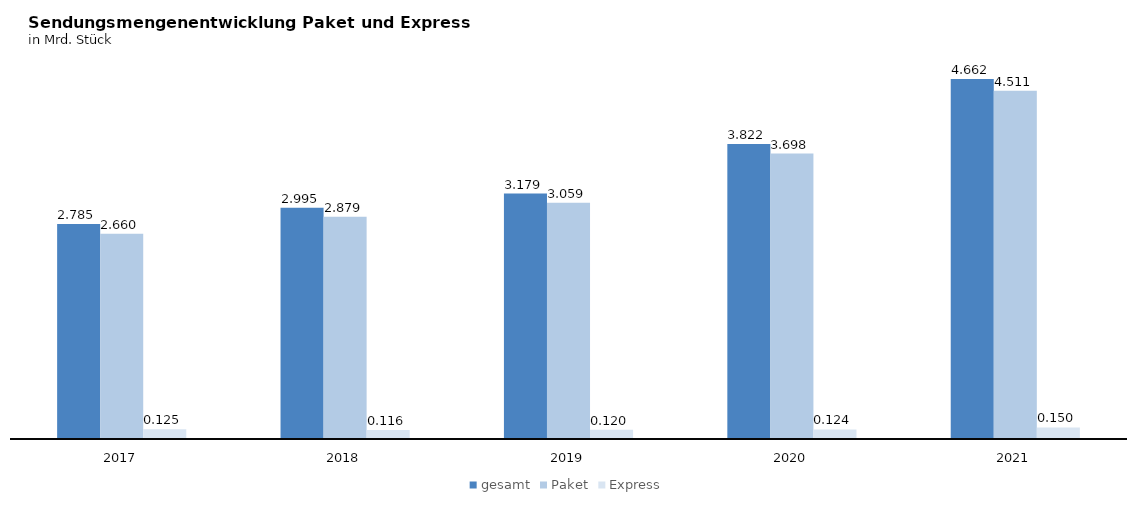
| Category | gesamt | Paket | Express |
|---|---|---|---|
| 2017.0 | 2.785 | 2.66 | 0.125 |
| 2018.0 | 2.995 | 2.879 | 0.116 |
| 2019.0 | 3.179 | 3.059 | 0.12 |
| 2020.0 | 3.822 | 3.698 | 0.124 |
| 2021.0 | 4.662 | 4.511 | 0.15 |